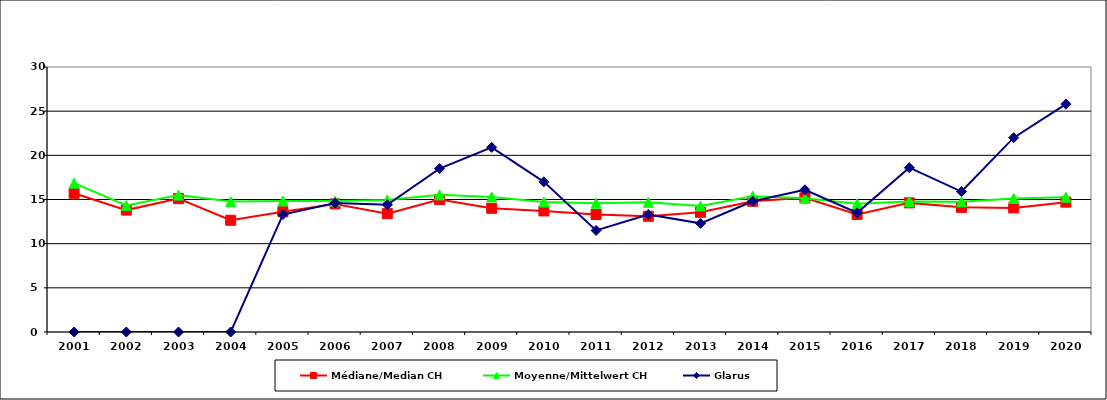
| Category | Médiane/Median CH | Moyenne/Mittelwert CH | Glarus |
|---|---|---|---|
| 2001.0 | 15.7 | 16.85 | 0 |
| 2002.0 | 13.8 | 14.325 | 0 |
| 2003.0 | 15.1 | 15.5 | 0 |
| 2004.0 | 12.65 | 14.763 | 0 |
| 2005.0 | 13.62 | 14.838 | 13.3 |
| 2006.0 | 14.5 | 14.827 | 14.6 |
| 2007.0 | 13.4 | 14.936 | 14.4 |
| 2008.0 | 15 | 15.524 | 18.5 |
| 2009.0 | 14 | 15.293 | 20.9 |
| 2010.0 | 13.7 | 14.722 | 17 |
| 2011.0 | 13.3 | 14.574 | 11.5 |
| 2012.0 | 13.1 | 14.682 | 13.3 |
| 2013.0 | 13.55 | 14.269 | 12.3 |
| 2014.0 | 14.8 | 15.38 | 14.8 |
| 2015.0 | 15.2 | 15.136 | 16.1 |
| 2016.0 | 13.3 | 14.519 | 13.5 |
| 2017.0 | 14.617 | 14.784 | 18.6 |
| 2018.0 | 14.111 | 14.738 | 15.9 |
| 2019.0 | 14.05 | 15.118 | 22 |
| 2020.0 | 14.7 | 15.265 | 25.8 |